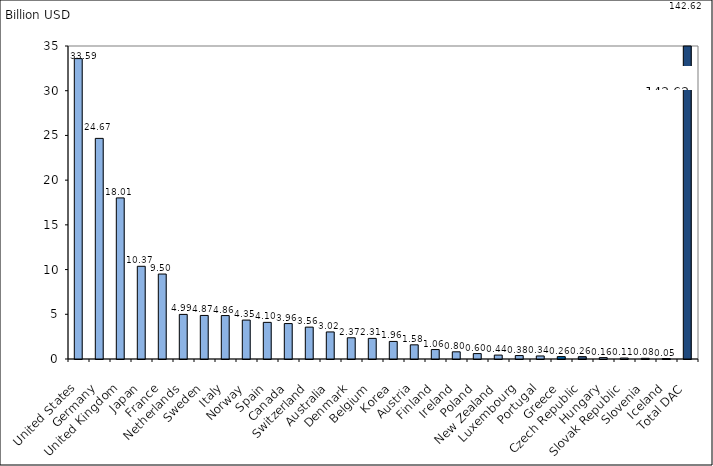
| Category | Series 0 |
|---|---|
| United States | 33.589 |
| Germany | 24.67 |
| United Kingdom | 18.013 |
| Japan | 10.368 |
| France | 9.501 |
| Netherlands | 4.988 |
| Sweden | 4.87 |
| Italy | 4.856 |
| Norway | 4.352 |
| Spain | 4.096 |
| Canada | 3.962 |
| Switzerland | 3.563 |
| Australia | 3.025 |
| Denmark | 2.372 |
| Belgium | 2.306 |
| Korea | 1.965 |
| Austria | 1.583 |
| Finland | 1.057 |
| Ireland | 0.802 |
| Poland | 0.603 |
| New Zealand | 0.438 |
| Luxembourg | 0.384 |
| Portugal | 0.34 |
| Greece | 0.264 |
| Czech Republic | 0.261 |
| Hungary | 0.155 |
| Slovak Republic | 0.107 |
| Slovenia | 0.08 |
| Iceland | 0.05 |
| Total DAC | 142.619 |